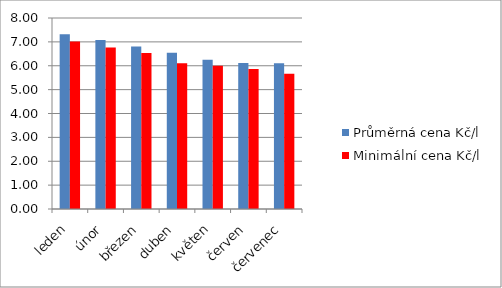
| Category | Průměrná cena Kč/l | Minimální cena Kč/l |
|---|---|---|
| leden | 7.32 | 7.02 |
| únor | 7.08 | 6.76 |
| březen | 6.81 | 6.53 |
| duben | 6.54 | 6.1 |
| květen | 6.25 | 6 |
| červen | 6.12 | 5.86 |
| červenec | 6.1 | 5.67 |